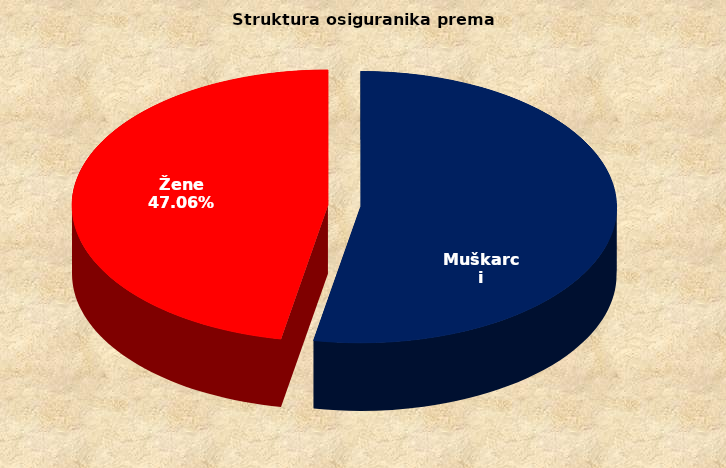
| Category | Series 0 |
|---|---|
| Muškarci | 855966 |
| Žene | 761040 |